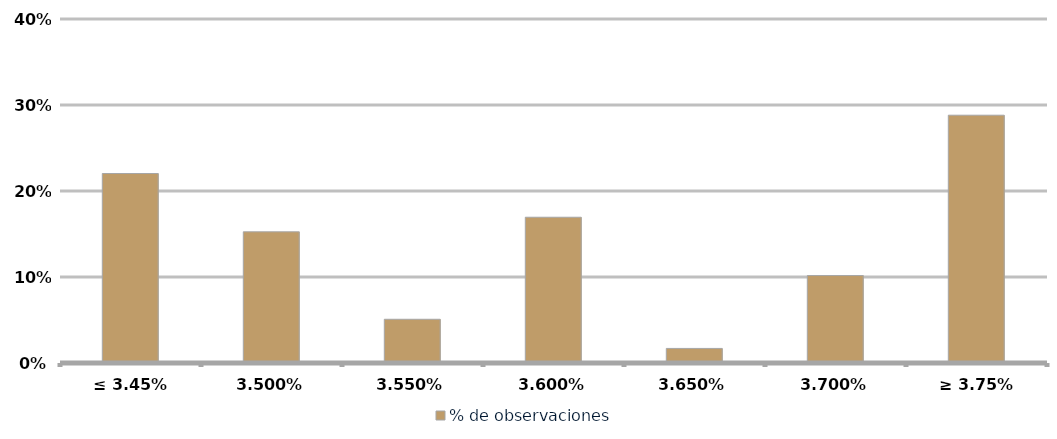
| Category | % de observaciones  |
|---|---|
| ≤ 3.45% | 0.22 |
| 3,50% | 0.153 |
| 3,55% | 0.051 |
| 3,60% | 0.169 |
| 3,65% | 0.017 |
| 3,70% | 0.102 |
| ≥ 3.75% | 0.288 |